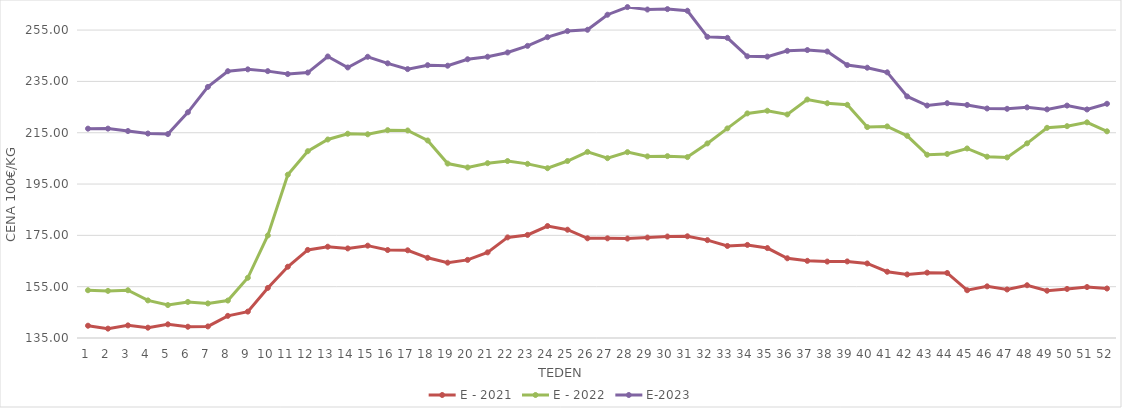
| Category | E - 2021 | E - 2022 | E-2023 |
|---|---|---|---|
| 1.0 | 139.79 | 153.61 | 216.59 |
| 2.0 | 138.65 | 153.36 | 216.6 |
| 3.0 | 139.92 | 153.61 | 215.66 |
| 4.0 | 139.02 | 149.65 | 214.69 |
| 5.0 | 140.33 | 147.84 | 214.48 |
| 6.0 | 139.39 | 149.05 | 222.96 |
| 7.0 | 139.51 | 148.47 | 232.85 |
| 8.0 | 143.63 | 149.6 | 238.98 |
| 9.0 | 145.29 | 158.47 | 239.7 |
| 10.0 | 154.51 | 174.96 | 239.01 |
| 11.0 | 162.771 | 198.64 | 237.87 |
| 12.0 | 169.33 | 207.8 | 238.45 |
| 13.0 | 170.58 | 212.36 | 244.72 |
| 14.0 | 169.91 | 214.61 | 240.44 |
| 15.0 | 170.99 | 214.39 | 244.6 |
| 16.0 | 169.28 | 215.99 | 242.05 |
| 17.0 | 169.18 | 215.87 | 239.79 |
| 18.0 | 166.25 | 211.98 | 241.33 |
| 19.0 | 164.36 | 202.99 | 241.12 |
| 20.0 | 165.44 | 201.47 | 243.64 |
| 21.0 | 168.37 | 203.13 | 244.62 |
| 22.0 | 174.21 | 203.97 | 246.28 |
| 23.0 | 175.17 | 202.87 | 248.85 |
| 24.0 | 178.64 | 201.17 | 252.25 |
| 25.0 | 177.2 | 203.98 | 254.62 |
| 26.0 | 173.86 | 207.54 | 255.13 |
| 27.0 | 173.84 | 205.08 | 260.99 |
| 28.0 | 173.76 | 207.43 | 263.97 |
| 29.0 | 174.14 | 205.78 | 263.01 |
| 30.0 | 174.54 | 205.88 | 263.18 |
| 31.0 | 174.64 | 205.51 | 262.54 |
| 32.0 | 173.14 | 210.83 | 252.38 |
| 33.0 | 170.87 | 216.68 | 251.98 |
| 34.0 | 171.28 | 222.53 | 244.78 |
| 35.0 | 170.05 | 223.57 | 244.66 |
| 36.0 | 166.07 | 222.12 | 246.92 |
| 37.0 | 165.07 | 227.94 | 247.22 |
| 38.0 | 164.79 | 226.49 | 246.66 |
| 39.0 | 164.84 | 225.89 | 241.36 |
| 40.0 | 164.05 | 217.21 | 240.34 |
| 41.0 | 160.83 | 217.46 | 238.54 |
| 42.0 | 159.76 | 213.8 | 229.14 |
| 43.0 | 160.47 | 206.42 | 225.6 |
| 44.0 | 160.34 | 206.73 | 226.51 |
| 45.0 | 153.62 | 208.86 | 225.83 |
| 46.0 | 155.13 | 205.66 | 224.44 |
| 47.0 | 153.91 | 205.37 | 224.32 |
| 48.0 | 155.56 | 210.86 | 224.88 |
| 49.0 | 153.43 | 216.91 | 224.1 |
| 50.0 | 154.12 | 217.56 | 225.58 |
| 51.0 | 154.86 | 219.05 | 224.07 |
| 52.0 | 154.29 | 215.55 | 226.29 |